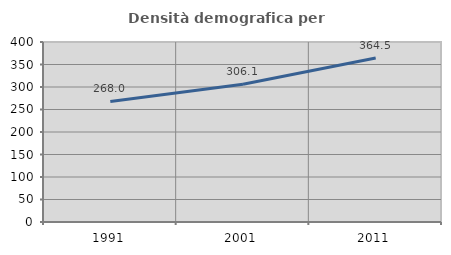
| Category | Densità demografica |
|---|---|
| 1991.0 | 267.962 |
| 2001.0 | 306.054 |
| 2011.0 | 364.452 |